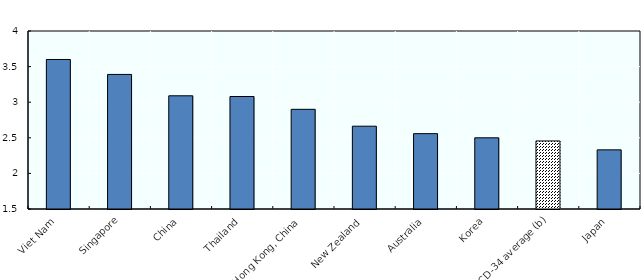
| Category | All households |
|---|---|
| Viet Nam | 3.6 |
| Singapore | 3.39 |
| China | 3.09 |
| Thailand | 3.08 |
| Hong Kong, China | 2.9 |
| New Zealand | 2.663 |
| Australia | 2.558 |
| Korea | 2.5 |
| OECD-34 average (b) | 2.456 |
| Japan | 2.331 |